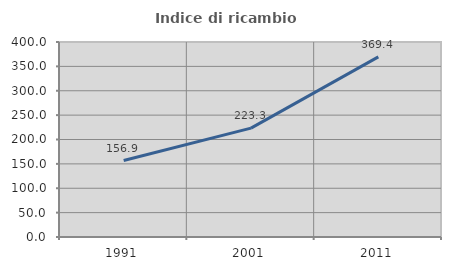
| Category | Indice di ricambio occupazionale  |
|---|---|
| 1991.0 | 156.912 |
| 2001.0 | 223.341 |
| 2011.0 | 369.429 |